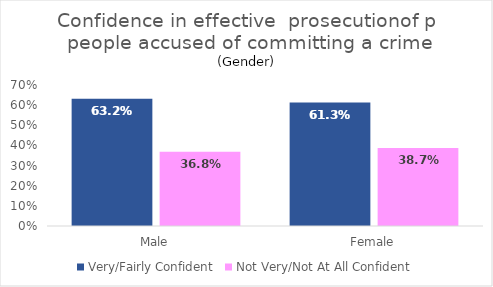
| Category | Very/Fairly Confident | Not Very/Not At All Confident |
|---|---|---|
| Male | 0.632 | 0.368 |
| Female | 0.613 | 0.387 |